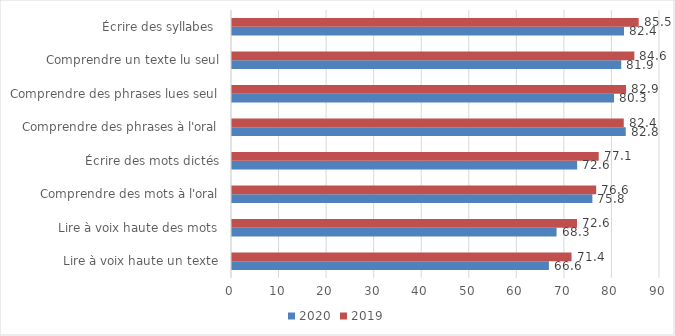
| Category | 2020 | 2019 |
|---|---|---|
| Lire à voix haute un texte | 66.64 | 71.4 |
| Lire à voix haute des mots | 68.25 | 72.56 |
| Comprendre des mots à l'oral | 75.78 | 76.58 |
| Écrire des mots dictés | 72.58 | 77.11 |
| Comprendre des phrases à l'oral | 82.79 | 82.38 |
| Comprendre des phrases lues seul | 80.34 | 82.87 |
| Comprendre un texte lu seul | 81.85 | 84.61 |
| Écrire des syllabes  | 82.43 | 85.52 |